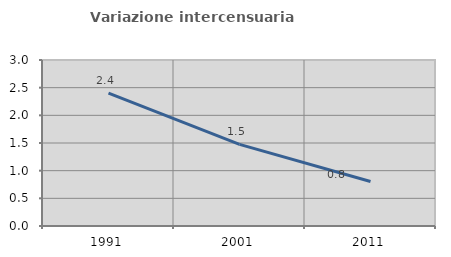
| Category | Variazione intercensuaria annua |
|---|---|
| 1991.0 | 2.4 |
| 2001.0 | 1.475 |
| 2011.0 | 0.804 |